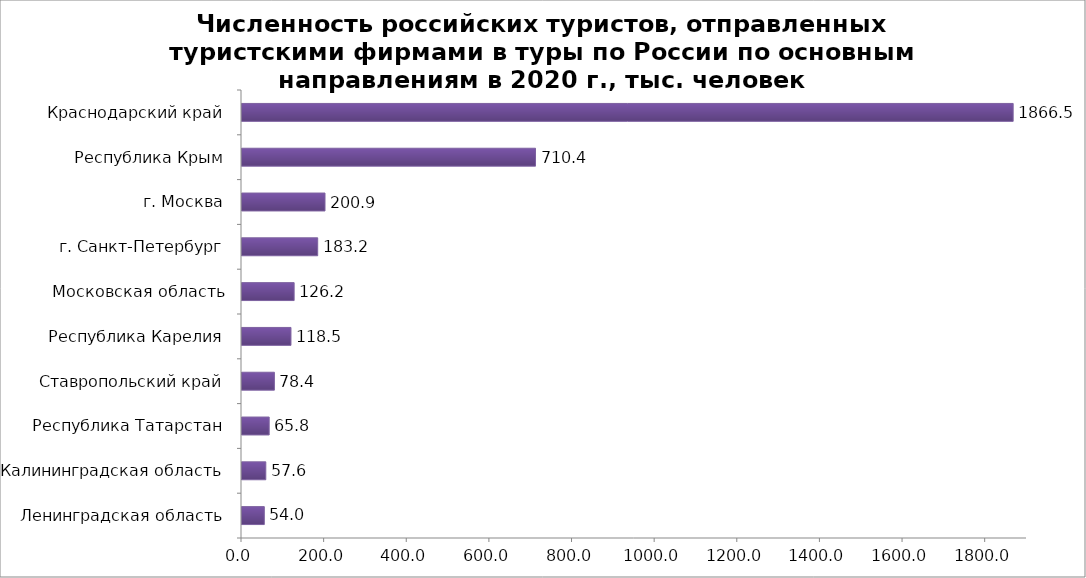
| Category | Series 0 |
|---|---|
| Ленинградская область | 54 |
| Калининградская область | 57.6 |
| Республика Татарстан | 65.8 |
| Ставропольский край | 78.4 |
| Республика Карелия | 118.5 |
| Московская область | 126.2 |
| г. Санкт-Петербург | 183.2 |
| г. Москва | 200.9 |
| Республика Крым | 710.4 |
| Краснодарский край | 1866.5 |